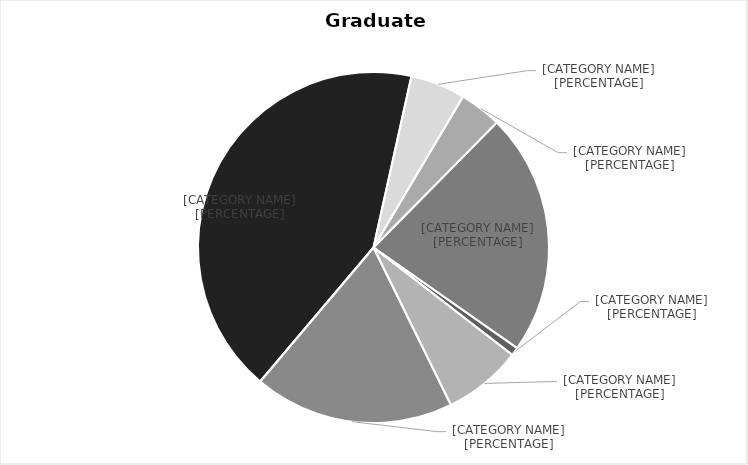
| Category | Series 0 |
|---|---|
| No College Designated | 9 |
| College of Business | 86 |
| College of Computing | 219 |
| College of Engineering | 502 |
| College of For Res & Env Sci | 60 |
| Interdisciplinary Programs | 46 |
| College of Sciences & Arts | 265 |